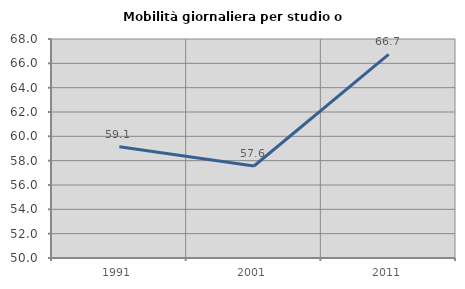
| Category | Mobilità giornaliera per studio o lavoro |
|---|---|
| 1991.0 | 59.139 |
| 2001.0 | 57.563 |
| 2011.0 | 66.739 |